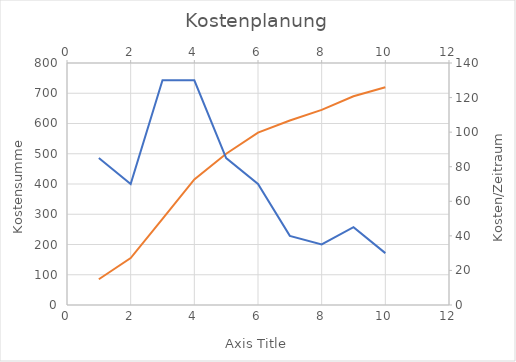
| Category | Kostensummenlinie |
|---|---|
| 0 | 85 |
| 1 | 155 |
| 2 | 285 |
| 3 | 415 |
| 4 | 500 |
| 5 | 570 |
| 6 | 610 |
| 7 | 645 |
| 8 | 690 |
| 9 | 720 |